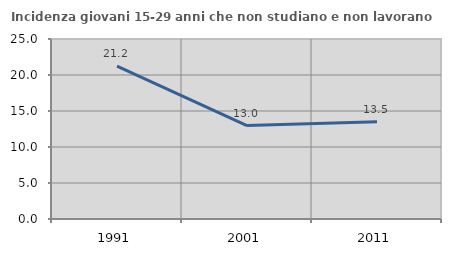
| Category | Incidenza giovani 15-29 anni che non studiano e non lavorano  |
|---|---|
| 1991.0 | 21.228 |
| 2001.0 | 12.984 |
| 2011.0 | 13.521 |